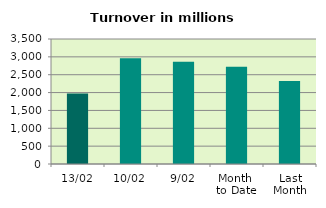
| Category | Series 0 |
|---|---|
| 13/02 | 1972.439 |
| 10/02 | 2959.584 |
| 9/02 | 2862.018 |
| Month 
to Date | 2721.248 |
| Last
Month | 2326.675 |